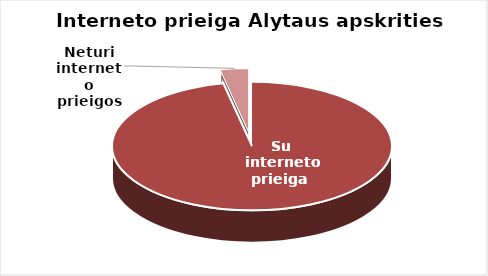
| Category | Series 0 |
|---|---|
| Su interneto prieiga  | 88 |
| Neturi interneto prieigos | 3 |